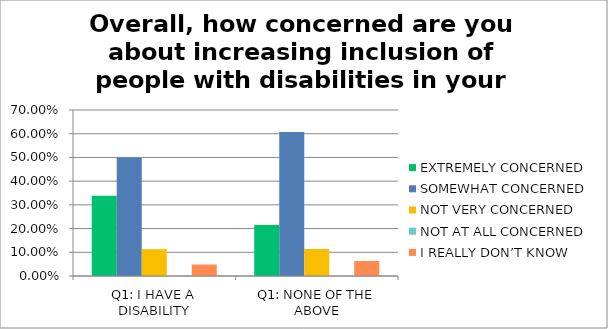
| Category | EXTREMELY CONCERNED | SOMEWHAT CONCERNED | NOT VERY CONCERNED | NOT AT ALL CONCERNED | I REALLY DON’T KNOW |
|---|---|---|---|---|---|
| Q1: I HAVE A DISABILITY | 0.339 | 0.5 | 0.113 | 0 | 0.048 |
| Q1: NONE OF THE ABOVE | 0.215 | 0.608 | 0.114 | 0 | 0.063 |